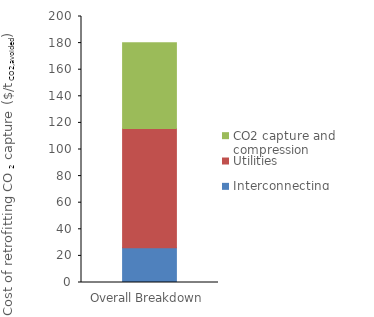
| Category | Interconnecting | Utilities | CO2 capture and compression |
|---|---|---|---|
| 0 | 26.208 | 89.51 | 64.57 |